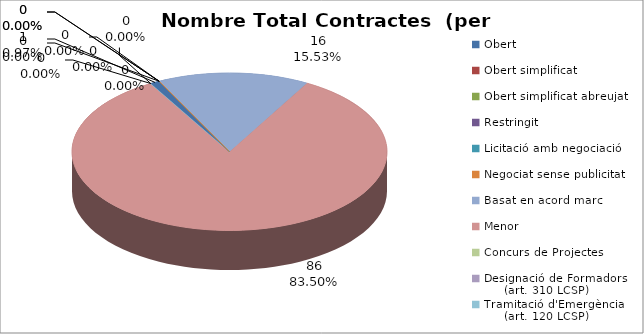
| Category | Nombre Total Contractes |
|---|---|
| Obert | 1 |
| Obert simplificat | 0 |
| Obert simplificat abreujat | 0 |
| Restringit | 0 |
| Licitació amb negociació | 0 |
| Negociat sense publicitat | 0 |
| Basat en acord marc | 16 |
| Menor | 86 |
| Concurs de Projectes | 0 |
| Designació de Formadors
     (art. 310 LCSP) | 0 |
| Tramitació d'Emergència
     (art. 120 LCSP) | 0 |